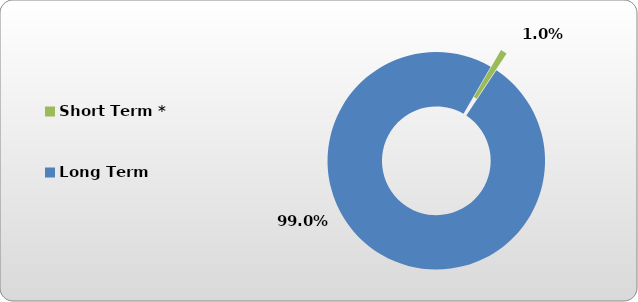
| Category | Short Term * |
|---|---|
| Short Term * | 5409.123 |
| Long Term | 553205.499 |